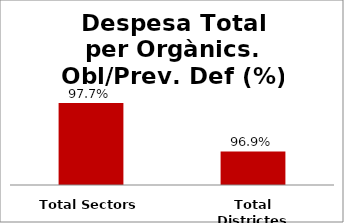
| Category | Series 0 |
|---|---|
| Total Sectors | 0.977 |
| Total Districtes | 0.969 |